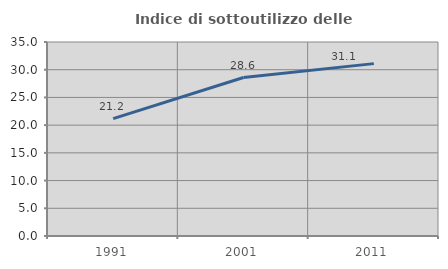
| Category | Indice di sottoutilizzo delle abitazioni  |
|---|---|
| 1991.0 | 21.174 |
| 2001.0 | 28.592 |
| 2011.0 | 31.1 |